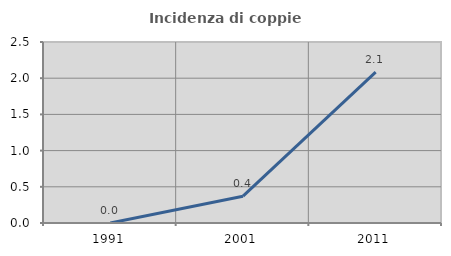
| Category | Incidenza di coppie miste |
|---|---|
| 1991.0 | 0 |
| 2001.0 | 0.37 |
| 2011.0 | 2.083 |